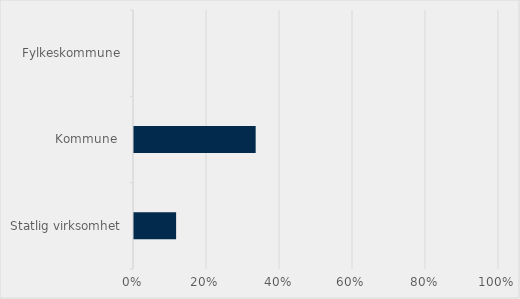
| Category | Prosent |
|---|---|
| Statlig virksomhet | 0.115 |
| Kommune  | 0.333 |
| Fylkeskommune | 0 |